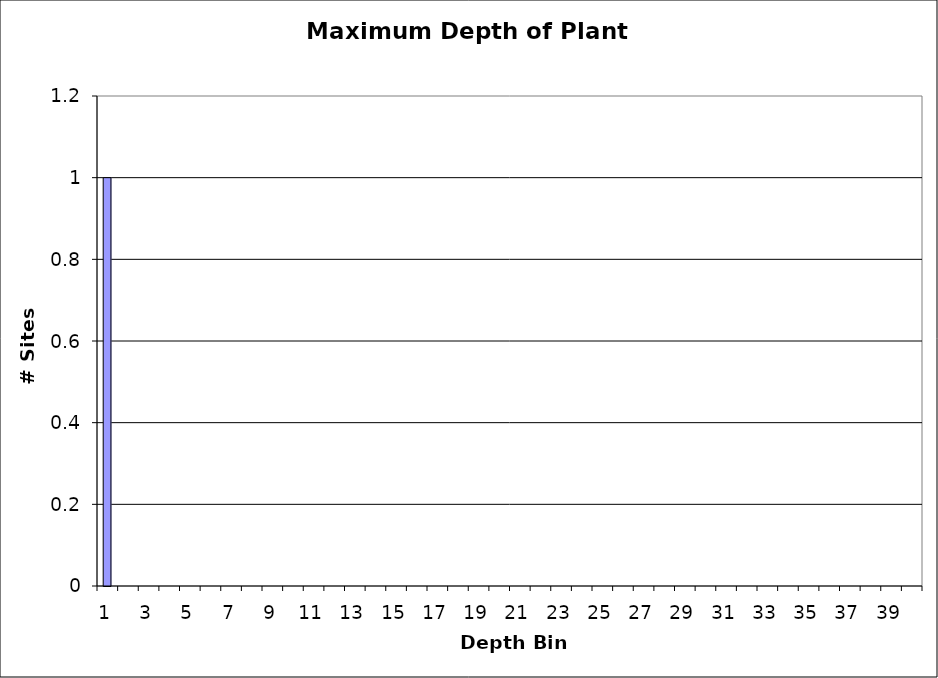
| Category | Series 0 |
|---|---|
| 1.0 | 1 |
| 2.0 | 0 |
| 3.0 | 0 |
| 4.0 | 0 |
| 5.0 | 0 |
| 6.0 | 0 |
| 7.0 | 0 |
| 8.0 | 0 |
| 9.0 | 0 |
| 10.0 | 0 |
| 11.0 | 0 |
| 12.0 | 0 |
| 13.0 | 0 |
| 14.0 | 0 |
| 15.0 | 0 |
| 16.0 | 0 |
| 17.0 | 0 |
| 18.0 | 0 |
| 19.0 | 0 |
| 20.0 | 0 |
| 21.0 | 0 |
| 22.0 | 0 |
| 23.0 | 0 |
| 24.0 | 0 |
| 25.0 | 0 |
| 26.0 | 0 |
| 27.0 | 0 |
| 28.0 | 0 |
| 29.0 | 0 |
| 30.0 | 0 |
| 31.0 | 0 |
| 32.0 | 0 |
| 33.0 | 0 |
| 34.0 | 0 |
| 35.0 | 0 |
| 36.0 | 0 |
| 37.0 | 0 |
| 38.0 | 0 |
| 39.0 | 0 |
| 40.0 | 0 |